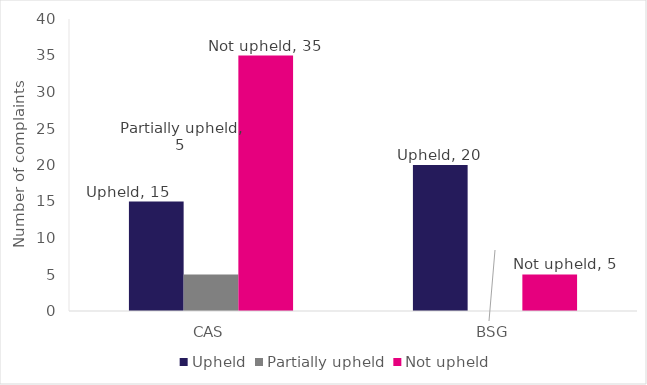
| Category | Upheld | Partially upheld | Not upheld |
|---|---|---|---|
| CAS | 15 | 5 | 35 |
| BSG | 20 | 0 | 5 |